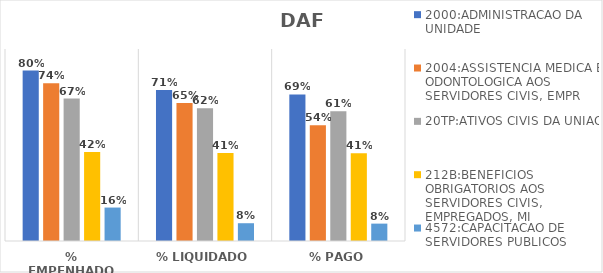
| Category | 2000:ADMINISTRACAO DA UNIDADE | 2004:ASSISTENCIA MEDICA E ODONTOLOGICA AOS SERVIDORES CIVIS, EMPR | 20TP:ATIVOS CIVIS DA UNIAO | 212B:BENEFICIOS OBRIGATORIOS AOS SERVIDORES CIVIS, EMPREGADOS, MI | 4572:CAPACITACAO DE SERVIDORES PUBLICOS FEDERAIS EM PROCESSO DE Q |
|---|---|---|---|---|---|
| % EMPENHADO | 0.799 | 0.739 | 0.667 | 0.417 | 0.157 |
| % LIQUIDADO | 0.708 | 0.647 | 0.622 | 0.412 | 0.083 |
| % PAGO | 0.687 | 0.543 | 0.609 | 0.412 | 0.081 |